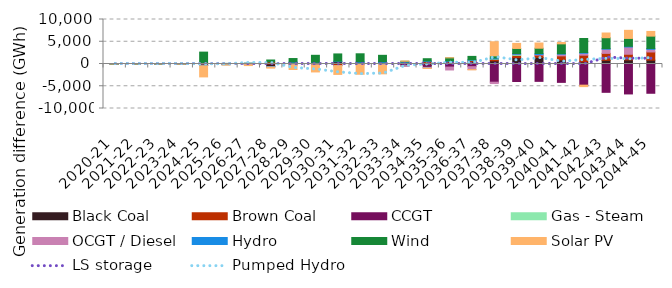
| Category | Black Coal | Brown Coal | CCGT | Gas - Steam | OCGT / Diesel | Hydro | Wind | Solar PV |
|---|---|---|---|---|---|---|---|---|
| 2020-21 | -0.031 | -0.011 | 0.001 | 0 | 0.002 | 0 | 0.007 | 0.003 |
| 2021-22 | -0.052 | -0.005 | 0.001 | -0.006 | 0.008 | 0.003 | 0.002 | 0.012 |
| 2022-23 | -0.02 | -0.03 | 0.006 | 0 | 0.004 | 0.004 | 0.009 | 0.004 |
| 2023-24 | -18.994 | 14.184 | -4.177 | 0.877 | 0.25 | 1.86 | 21.675 | -0.044 |
| 2024-25 | -272.786 | 266.033 | -31.248 | -1.005 | -1.831 | -87.663 | 2404.233 | -2503.503 |
| 2025-26 | 82.801 | -56.58 | -24.794 | -13.479 | -18.806 | -52.658 | 55.073 | -85.11 |
| 2026-27 | -89.165 | 113.114 | -36.996 | -34.546 | -31.926 | 33.782 | 31.881 | -162.04 |
| 2027-28 | -572.474 | 468.245 | -30.756 | -42.981 | -25.469 | -36.142 | 430.846 | -222.21 |
| 2028-29 | 257.082 | -148.397 | 7.398 | -60.479 | -23.437 | 169.829 | 794.323 | -1009.316 |
| 2029-30 | -235.099 | 179.189 | 59.952 | -2.95 | -22.467 | 130.079 | 1585.138 | -1524.921 |
| 2030-31 | 506.198 | -340.621 | -17.718 | -42.661 | -14.763 | 127.666 | 1630.206 | -1925.539 |
| 2031-32 | -129.694 | 45.039 | 153.183 | -21.111 | -3.521 | 277.946 | 1818.177 | -2152.022 |
| 2032-33 | -129.555 | 71.147 | 170.525 | -83.914 | -15.384 | 259.033 | 1449.626 | -1984.138 |
| 2033-34 | -75.029 | 276.95 | -348.481 | -33.356 | -70.511 | 195.455 | 143.863 | 54.617 |
| 2034-35 | -309.249 | 574.978 | -453.351 | -79.311 | -137.42 | 123.1 | 490.839 | -24.401 |
| 2035-36 | -49.528 | 559.107 | -642.755 | 17.507 | -648.13 | 91.828 | 713.282 | 20.536 |
| 2036-37 | 504.172 | 304.401 | -598.506 | 29.716 | -653.42 | 127.196 | 743.597 | -59.645 |
| 2037-38 | 714.824 | 351.155 | -4088.499 | 81.343 | -308.557 | 206.444 | 473.611 | 3174.139 |
| 2038-39 | 1435.913 | 501.654 | -3934.024 | 205.881 | 55.918 | 144.03 | 1149.097 | 1136.796 |
| 2039-40 | 1479.282 | 514.95 | -3900.146 | 0 | 125.641 | 243.217 | 1183.992 | 1168.136 |
| 2040-41 | 920.119 | 911.908 | -4128.72 | 0 | 378.093 | 112.355 | 2204.395 | 307.347 |
| 2041-42 | 454.581 | 1528.744 | -4752.811 | 0 | 436.876 | 169.149 | 3139.726 | -329.918 |
| 2042-43 | 823.84 | 1562.058 | -6364.096 | 0 | 948.287 | 129.917 | 2440.907 | 1059.34 |
| 2043-44 | 913.782 | 1275.849 | -6728.557 | 0 | 1632.332 | 155.849 | 1770.947 | 1817.177 |
| 2044-45 | 858.262 | 1841.61 | -6576.546 | 0 | 598.728 | 191.373 | 2773.093 | 1055.501 |